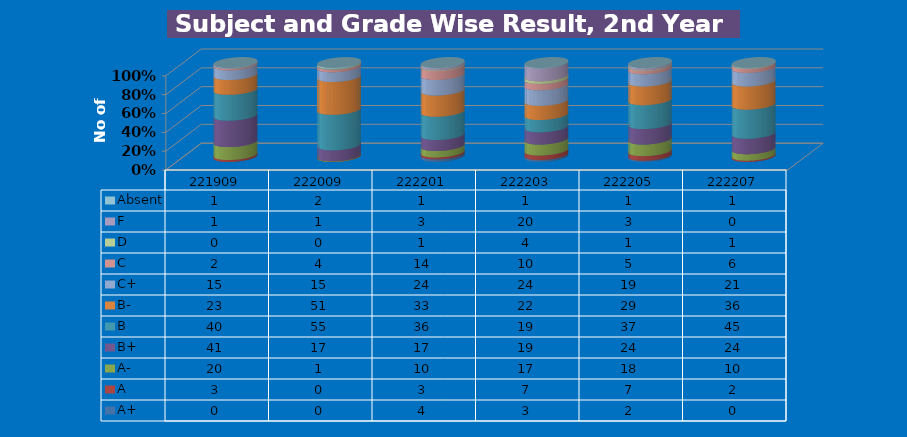
| Category | A+ | A | A- | B+ | B | B- | C+ | C | D | F | Absent |
|---|---|---|---|---|---|---|---|---|---|---|---|
| 221909.0 | 0 | 3 | 20 | 41 | 40 | 23 | 15 | 2 | 0 | 1 | 1 |
| 222009.0 | 0 | 0 | 1 | 17 | 55 | 51 | 15 | 4 | 0 | 1 | 2 |
| 222201.0 | 4 | 3 | 10 | 17 | 36 | 33 | 24 | 14 | 1 | 3 | 1 |
| 222203.0 | 3 | 7 | 17 | 19 | 19 | 22 | 24 | 10 | 4 | 20 | 1 |
| 222205.0 | 2 | 7 | 18 | 24 | 37 | 29 | 19 | 5 | 1 | 3 | 1 |
| 222207.0 | 0 | 2 | 10 | 24 | 45 | 36 | 21 | 6 | 1 | 0 | 1 |